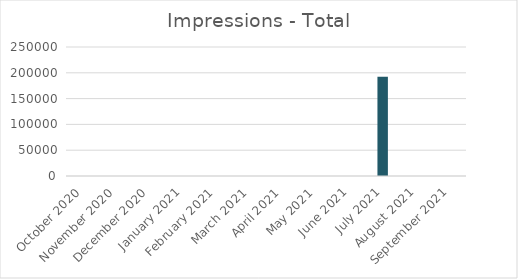
| Category | Total |
|---|---|
| October 2020 | 0 |
| November 2020 | 0 |
| December 2020 | 0 |
| January 2021 | 0 |
| February 2021 | 0 |
| March 2021 | 0 |
| April 2021 | 0 |
| May 2021 | 0 |
| June 2021 | 0 |
| July 2021 | 192481 |
| August 2021 | 0 |
| September 2021 | 0 |